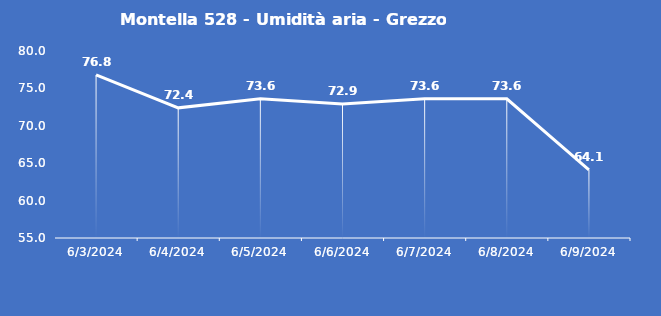
| Category | Montella 528 - Umidità aria - Grezzo (%) |
|---|---|
| 6/3/24 | 76.8 |
| 6/4/24 | 72.4 |
| 6/5/24 | 73.6 |
| 6/6/24 | 72.9 |
| 6/7/24 | 73.6 |
| 6/8/24 | 73.6 |
| 6/9/24 | 64.1 |